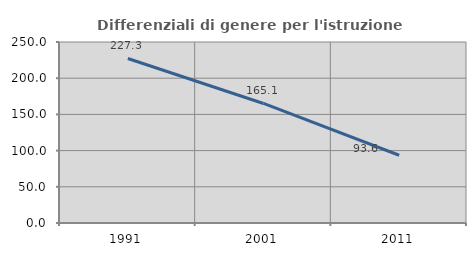
| Category | Differenziali di genere per l'istruzione superiore |
|---|---|
| 1991.0 | 227.273 |
| 2001.0 | 165.094 |
| 2011.0 | 93.555 |